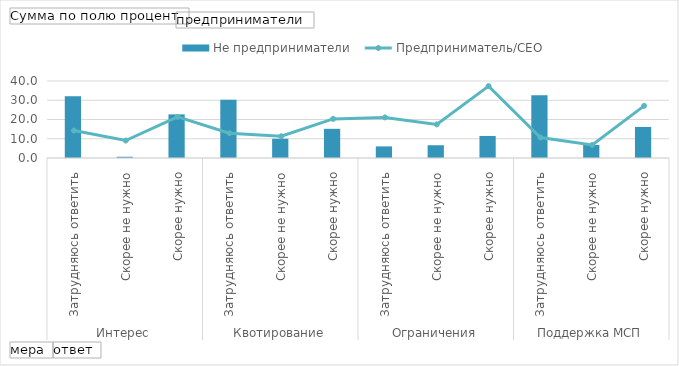
| Category | Не предприниматели |
|---|---|
| 0 | 32.039 |
| 1 | 0.647 |
| 2 | 22.654 |
| 3 | 30.323 |
| 4 | 10 |
| 5 | 15.161 |
| 6 | 6.024 |
| 7 | 6.627 |
| 8 | 11.446 |
| 9 | 32.581 |
| 10 | 6.774 |
| 11 | 16.129 |